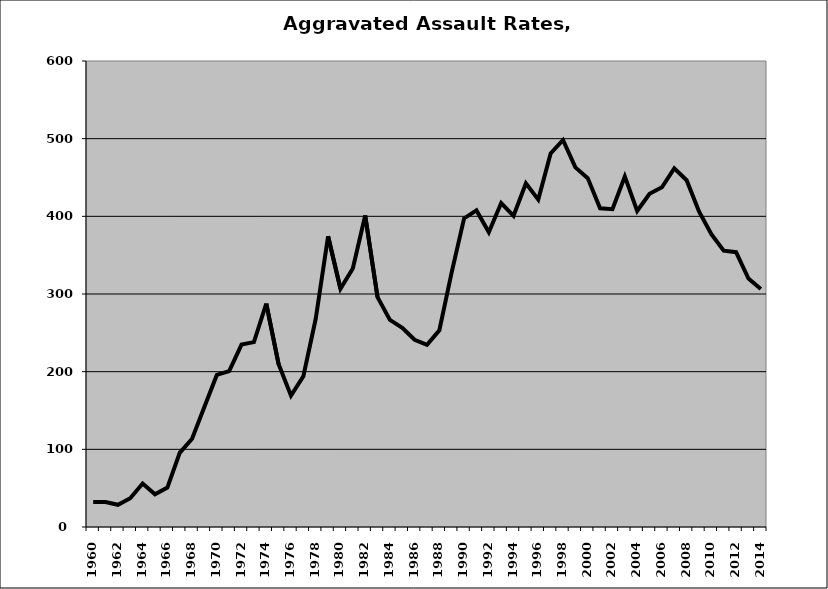
| Category | Aggravated Assault |
|---|---|
| 1960.0 | 32.266 |
| 1961.0 | 32.096 |
| 1962.0 | 28.571 |
| 1963.0 | 36.975 |
| 1964.0 | 56.008 |
| 1965.0 | 42.178 |
| 1966.0 | 50.781 |
| 1967.0 | 95.42 |
| 1968.0 | 113.67 |
| 1969.0 | 154.815 |
| 1970.0 | 195.766 |
| 1971.0 | 200.717 |
| 1972.0 | 234.867 |
| 1973.0 | 238.021 |
| 1974.0 | 287.609 |
| 1975.0 | 209.499 |
| 1976.0 | 169.072 |
| 1977.0 | 194.158 |
| 1978.0 | 268.096 |
| 1979.0 | 374.399 |
| 1980.0 | 306.669 |
| 1981.0 | 332.776 |
| 1982.0 | 401.163 |
| 1983.0 | 295.875 |
| 1984.0 | 266.721 |
| 1985.0 | 256.592 |
| 1986.0 | 241.074 |
| 1987.0 | 234.627 |
| 1988.0 | 253.333 |
| 1989.0 | 328.083 |
| 1990.0 | 397.347 |
| 1991.0 | 407.647 |
| 1992.0 | 379.536 |
| 1993.0 | 417.143 |
| 1994.0 | 400.708 |
| 1995.0 | 442.538 |
| 1996.0 | 421.517 |
| 1997.0 | 480.874 |
| 1998.0 | 498.253 |
| 1999.0 | 463.016 |
| 2000.0 | 449.209 |
| 2001.0 | 410.37 |
| 2002.0 | 409.209 |
| 2003.0 | 451.375 |
| 2004.0 | 406.834 |
| 2005.0 | 429.111 |
| 2006.0 | 437.388 |
| 2007.0 | 461.86 |
| 2008.0 | 446.468 |
| 2009.0 | 406.385 |
| 2010.0 | 377.088 |
| 2011.0 | 355.783 |
| 2012.0 | 353.851 |
| 2013.0 | 319.917 |
| 2014.0 | 306.43 |